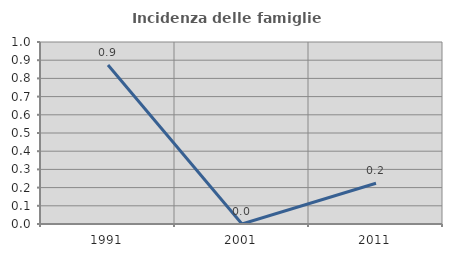
| Category | Incidenza delle famiglie numerose |
|---|---|
| 1991.0 | 0.873 |
| 2001.0 | 0 |
| 2011.0 | 0.224 |